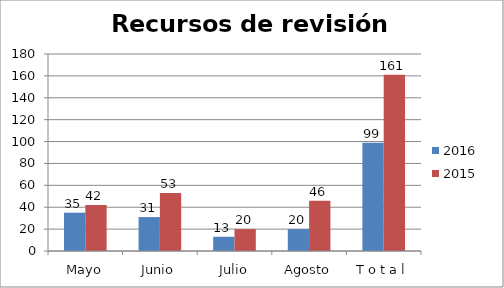
| Category | 2016 | 2015 |
|---|---|---|
| Mayo | 35 | 42 |
| Junio | 31 | 53 |
| Julio | 13 | 20 |
| Agosto | 20 | 46 |
| T o t a l | 99 | 161 |